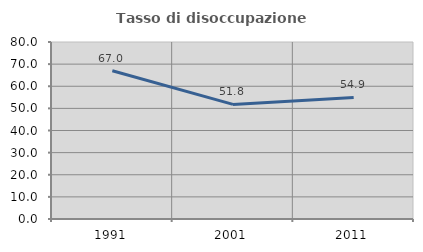
| Category | Tasso di disoccupazione giovanile  |
|---|---|
| 1991.0 | 67.027 |
| 2001.0 | 51.786 |
| 2011.0 | 54.93 |